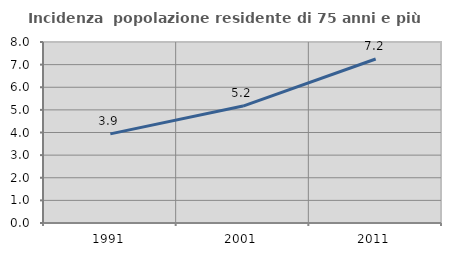
| Category | Incidenza  popolazione residente di 75 anni e più |
|---|---|
| 1991.0 | 3.938 |
| 2001.0 | 5.169 |
| 2011.0 | 7.249 |